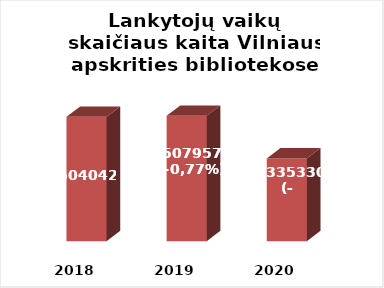
| Category | Series 0 |
|---|---|
| 2018.0 | 504042 |
| 2019.0 | 507957 |
| 2020.0 | 335330 |